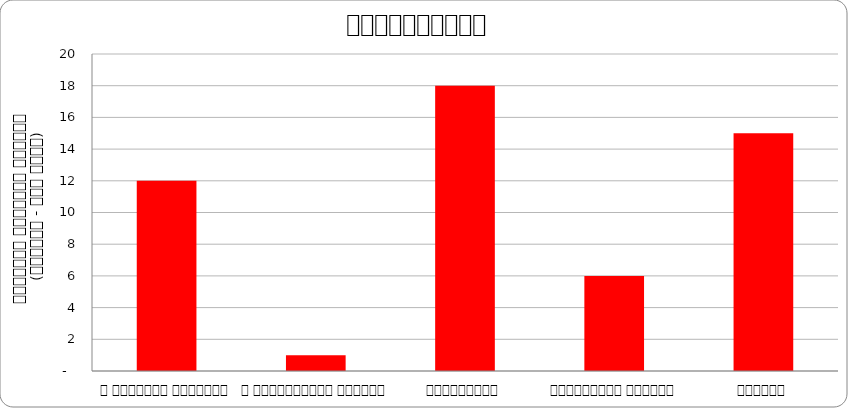
| Category | अर्थतन्त्र |
|---|---|
| द हिमालयन टाइम्स् | 12 |
| द काठमाण्डौं पोस्ट् | 1 |
| कान्तिपुर | 18 |
| अन्नपूर्ण पोस्ट् | 6 |
| नागरिक | 15 |